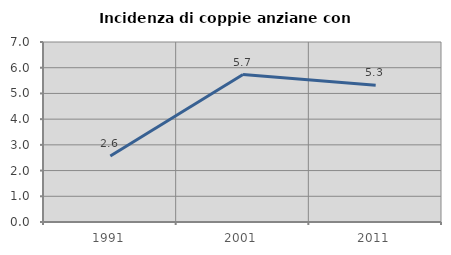
| Category | Incidenza di coppie anziane con figli |
|---|---|
| 1991.0 | 2.564 |
| 2001.0 | 5.732 |
| 2011.0 | 5.316 |